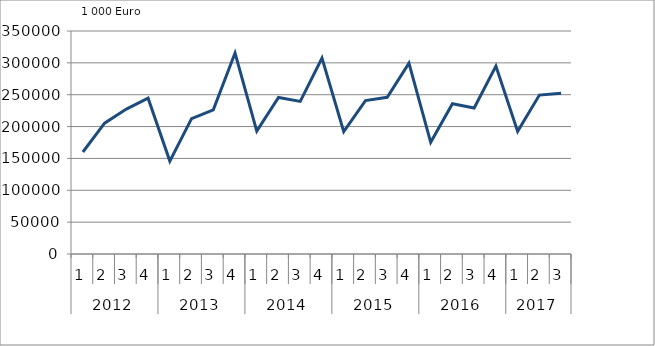
| Category | Ausbaugewerblicher Umsatz3 |
|---|---|
| 0 | 160065 |
| 1 | 205323 |
| 2 | 227469 |
| 3 | 244537 |
| 4 | 145792.596 |
| 5 | 212577 |
| 6 | 226327.748 |
| 7 | 315433.896 |
| 8 | 193004.858 |
| 9 | 245754.159 |
| 10 | 239547.85 |
| 11 | 307688.935 |
| 12 | 192043.756 |
| 13 | 240826.879 |
| 14 | 245916.087 |
| 15 | 299455.378 |
| 16 | 175225.59 |
| 17 | 235781.631 |
| 18 | 229227.559 |
| 19 | 294992.157 |
| 20 | 192499.539 |
| 21 | 249394.388 |
| 22 | 252146.755 |